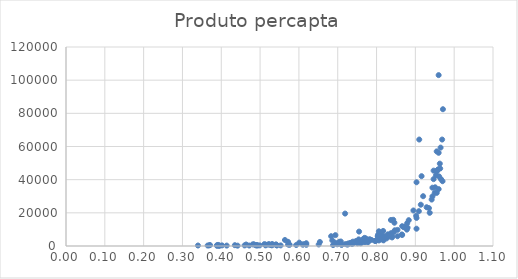
| Category | Produto percapta |
|---|---|
| 0.971 | 82480 |
| 0.97 | 39066 |
| 0.969 | 64190 |
| 0.966 | 40329 |
| 0.965 | 59324 |
| 0.964 | 46750 |
| 0.963 | 49662 |
| 0.961 | 41970 |
| 0.96 | 56207 |
| 0.96 | 34313 |
| 0.96 | 103042 |
| 0.959 | 46261 |
| 0.956 | 45592 |
| 0.955 | 44879 |
| 0.955 | 32017 |
| 0.955 | 57051 |
| 0.953 | 42609 |
| 0.951 | 35396 |
| 0.95 | 32086 |
| 0.947 | 45442 |
| 0.947 | 40324 |
| 0.944 | 35163 |
| 0.944 | 29912 |
| 0.942 | 27995 |
| 0.937 | 20014 |
| 0.935 | 22835 |
| 0.929 | 23379 |
| 0.92 | 30032 |
| 0.916 | 42102 |
| 0.914 | 24895 |
| 0.91 | 64193 |
| 0.909 | 20998 |
| 0.903 | 38436 |
| 0.903 | 16934 |
| 0.903 | 10427 |
| 0.902 | 18203 |
| 0.895 | 21421 |
| 0.883 | 15578 |
| 0.88 | 11072 |
| 0.879 | 13766 |
| 0.878 | 9878 |
| 0.871 | 11559 |
| 0.87 | 11356 |
| 0.866 | 11930 |
| 0.866 | 6644 |
| 0.865 | 6960 |
| 0.854 | 9715 |
| 0.854 | 5887 |
| 0.847 | 9475 |
| 0.846 | 14031 |
| 0.844 | 8299 |
| 0.843 | 15800 |
| 0.84 | 5833 |
| 0.84 | 5163 |
| 0.837 | 7703 |
| 0.837 | 15668 |
| 0.834 | 5804 |
| 0.829 | 7033 |
| 0.826 | 5435 |
| 0.826 | 4615 |
| 0.821 | 5834 |
| 0.818 | 3405 |
| 0.817 | 9079 |
| 0.817 | 3767 |
| 0.813 | 5724 |
| 0.813 | 6855 |
| 0.812 | 4014 |
| 0.807 | 4724 |
| 0.806 | 3846 |
| 0.806 | 8877 |
| 0.806 | 3335 |
| 0.804 | 5383 |
| 0.804 | 6772 |
| 0.803 | 5944 |
| 0.798 | 3059 |
| 0.796 | 3035 |
| 0.787 | 3652 |
| 0.783 | 3844 |
| 0.782 | 4028 |
| 0.778 | 2313 |
| 0.777 | 3772 |
| 0.772 | 4596 |
| 0.772 | 2432 |
| 0.772 | 4200 |
| 0.771 | 2894 |
| 0.771 | 3456 |
| 0.77 | 2769 |
| 0.769 | 4896 |
| 0.769 | 3425 |
| 0.768 | 2474 |
| 0.766 | 4272 |
| 0.761 | 1997 |
| 0.759 | 1616 |
| 0.755 | 8696 |
| 0.754 | 3996 |
| 0.751 | 1639 |
| 0.747 | 2973 |
| 0.742 | 1898 |
| 0.739 | 2606 |
| 0.737 | 1160 |
| 0.734 | 1918 |
| 0.732 | 1722 |
| 0.729 | 1379 |
| 0.727 | 1507 |
| 0.725 | 806 |
| 0.72 | 1156 |
| 0.719 | 19552 |
| 0.71 | 830 |
| 0.71 | 715 |
| 0.708 | 2705 |
| 0.704 | 2536 |
| 0.703 | 1729 |
| 0.699 | 1022 |
| 0.694 | 6544 |
| 0.693 | 2001 |
| 0.688 | 551 |
| 0.686 | 3372 |
| 0.683 | 5914 |
| 0.654 | 2434 |
| 0.651 | 916 |
| 0.619 | 1668 |
| 0.619 | 701 |
| 0.612 | 1046 |
| 0.61 | 784 |
| 0.601 | 2030 |
| 0.593 | 578 |
| 0.576 | 714 |
| 0.575 | 1006 |
| 0.572 | 879 |
| 0.572 | 2521 |
| 0.564 | 3623 |
| 0.553 | 367 |
| 0.543 | 375 |
| 0.543 | 431 |
| 0.541 | 645 |
| 0.541 | 990 |
| 0.532 | 699 |
| 0.531 | 1199 |
| 0.53 | 400 |
| 0.526 | 646 |
| 0.523 | 1116 |
| 0.52 | 847 |
| 0.514 | 798 |
| 0.514 | 381 |
| 0.511 | 1118 |
| 0.499 | 380 |
| 0.493 | 256 |
| 0.492 | 601 |
| 0.489 | 373 |
| 0.484 | 1027 |
| 0.481 | 953 |
| 0.472 | 284 |
| 0.464 | 900 |
| 0.46 | 343 |
| 0.442 | 198 |
| 0.435 | 487 |
| 0.414 | 245 |
| 0.402 | 364 |
| 0.396 | 211 |
| 0.394 | 115 |
| 0.392 | 658 |
| 0.389 | 143 |
| 0.389 | 458 |
| 0.371 | 556 |
| 0.369 | 394 |
| 0.365 | 284 |
| 0.34 | 294 |